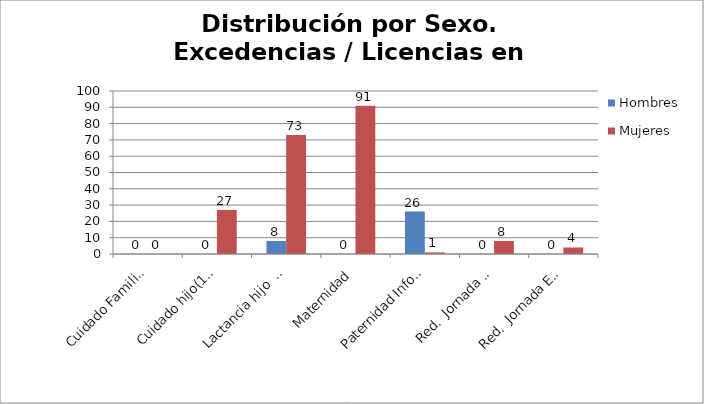
| Category | Hombres | Mujeres |
|---|---|---|
| Cuidado Familiar(hasta2ºgrado) | 0 | 0 |
| Cuidado hijo(1er y 2º año) | 0 | 27 |
| Lactancia hijo  < 12 meses | 8 | 73 |
| Maternidad | 0 | 91 |
| Paternidad Informativo | 26 | 1 |
| Red.  Jornada Cuid  Hij/Fam | 0 | 8 |
| Red.  Jornada Enf  Gr. Fami | 0 | 4 |